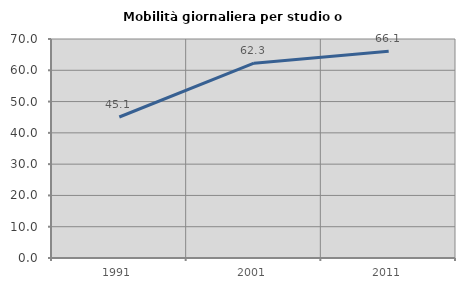
| Category | Mobilità giornaliera per studio o lavoro |
|---|---|
| 1991.0 | 45.074 |
| 2001.0 | 62.274 |
| 2011.0 | 66.102 |